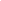
| Category | Series 0 |
|---|---|
| TOTAL | 40500 |
| VENTA MINIMA | 0 |
| VENTA MAXIMA | 13500 |
| VENTA PROMEDIO | 6750 |